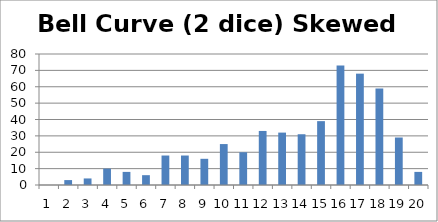
| Category | Bell Curve (2 dice) Skewed High |
|---|---|
| 0 | 0 |
| 1 | 3 |
| 2 | 4 |
| 3 | 10 |
| 4 | 8 |
| 5 | 6 |
| 6 | 18 |
| 7 | 18 |
| 8 | 16 |
| 9 | 25 |
| 10 | 20 |
| 11 | 33 |
| 12 | 32 |
| 13 | 31 |
| 14 | 39 |
| 15 | 73 |
| 16 | 68 |
| 17 | 59 |
| 18 | 29 |
| 19 | 8 |